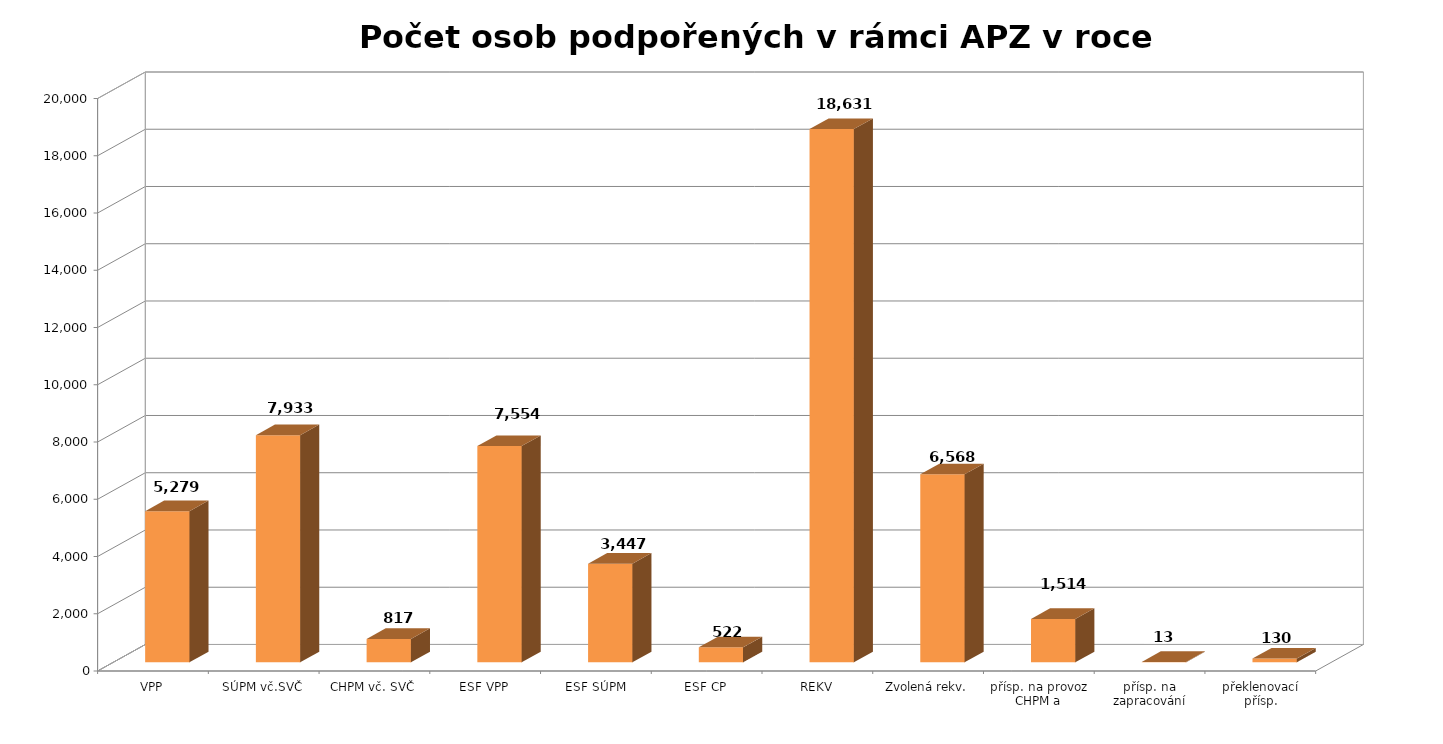
| Category | Series 0 |
|---|---|
| VPP | 5279 |
| SÚPM vč.SVČ | 7933 |
| CHPM vč. SVČ | 817 |
| ESF VPP | 7554 |
| ESF SÚPM | 3447 |
| ESF CP | 522 |
| REKV | 18631 |
| Zvolená rekv. | 6568 |
| přísp. na provoz CHPM a CHPM-SVČ | 1514 |
| přísp. na zapracování | 13 |
| překlenovací přísp. | 130 |